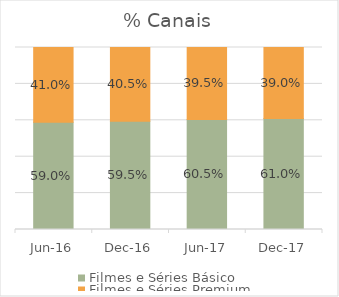
| Category | Filmes e Séries Básico | Filmes e Séries Premium |
|---|---|---|
| 2016-06-01 | 0.59 | 0.41 |
| 2016-12-01 | 0.595 | 0.405 |
| 2017-06-01 | 0.605 | 0.395 |
| 2017-12-01 | 0.61 | 0.39 |